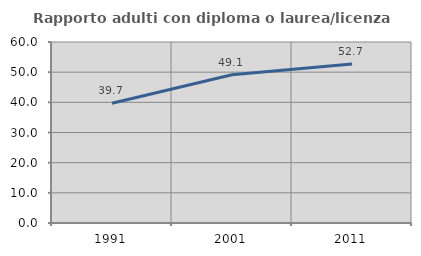
| Category | Rapporto adulti con diploma o laurea/licenza media  |
|---|---|
| 1991.0 | 39.7 |
| 2001.0 | 49.137 |
| 2011.0 | 52.669 |